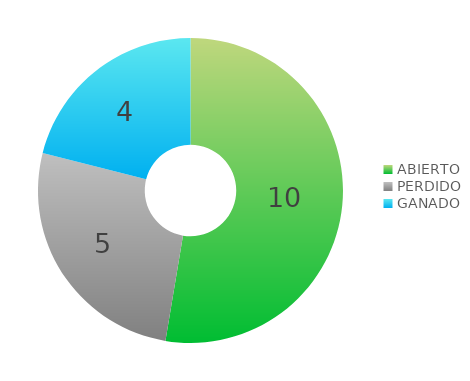
| Category | Series 0 |
|---|---|
| ABIERTO | 10 |
| PERDIDO | 5 |
| GANADO | 4 |